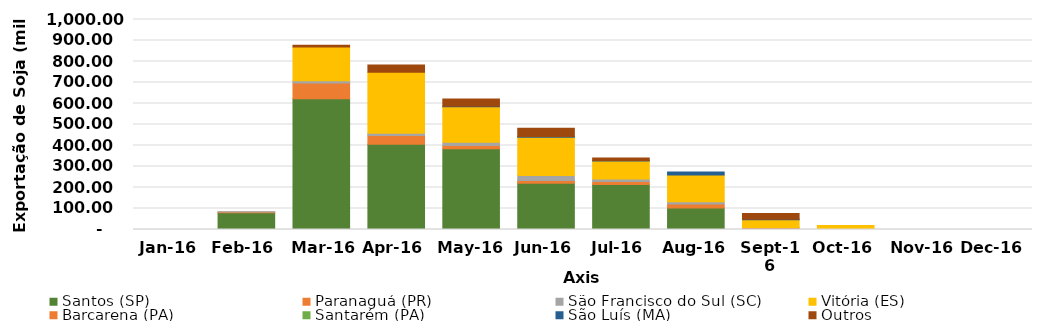
| Category | Santos (SP) | Paranaguá (PR) | São Francisco do Sul (SC) | Vitória (ES) | Barcarena (PA) | Santarém (PA) | São Luís (MA) | Outros |
|---|---|---|---|---|---|---|---|---|
| 2016-01-01 | 0 | 0 | 0 | 0 | 0 | 0 | 0 | 0 |
| 2016-02-01 | 79469 | 4377 | 1014 | 0 | 0 | 0 | 0 | 0 |
| 2016-03-01 | 622760 | 74647 | 10741 | 161293 | 0 | 0 | 0 | 7875 |
| 2016-04-01 | 406248 | 41646 | 10582 | 290446 | 0 | 0 | 0 | 34667 |
| 2016-05-01 | 385083 | 14484 | 15704 | 169065 | 0 | 0 | 2800 | 34869 |
| 2016-06-01 | 220507 | 12551 | 23664 | 182615 | 0 | 0 | 3147 | 39433 |
| 2016-07-01 | 214471 | 13745 | 12120 | 86147 | 0 | 0 | 2644 | 11383 |
| 2016-08-01 | 102878 | 18025 | 11695 | 126741 | 0 | 0 | 14373 | 0 |
| 2016-09-01 | 0 | 7798 | 1772 | 37140 | 0 | 0 | 1555 | 27373 |
| 2016-10-01 | 0 | 811 | 0 | 18479 | 0 | 0 | 0 | 0 |
| 2016-11-01 | 0 | 0 | 0 | 0 | 0 | 0 | 0 | 0 |
| 2016-12-01 | 0 | 0 | 0 | 0 | 0 | 0 | 0 | 0 |